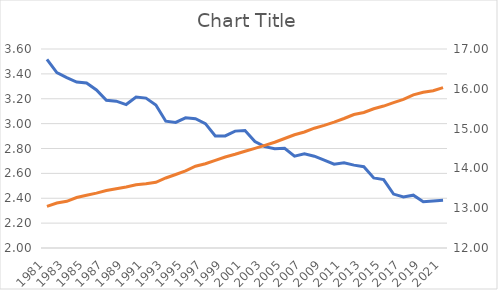
| Category | Relative price |
|---|---|
| 1981.0 | 3.517 |
| 1982.0 | 3.41 |
| 1983.0 | 3.369 |
| 1984.0 | 3.335 |
| 1985.0 | 3.326 |
| 1986.0 | 3.27 |
| 1987.0 | 3.187 |
| 1988.0 | 3.18 |
| 1989.0 | 3.153 |
| 1990.0 | 3.213 |
| 1991.0 | 3.205 |
| 1992.0 | 3.15 |
| 1993.0 | 3.02 |
| 1994.0 | 3.01 |
| 1995.0 | 3.047 |
| 1996.0 | 3.039 |
| 1997.0 | 3 |
| 1998.0 | 2.901 |
| 1999.0 | 2.901 |
| 2000.0 | 2.94 |
| 2001.0 | 2.945 |
| 2002.0 | 2.856 |
| 2003.0 | 2.815 |
| 2004.0 | 2.798 |
| 2005.0 | 2.802 |
| 2006.0 | 2.739 |
| 2007.0 | 2.757 |
| 2008.0 | 2.738 |
| 2009.0 | 2.706 |
| 2010.0 | 2.674 |
| 2011.0 | 2.685 |
| 2012.0 | 2.666 |
| 2013.0 | 2.654 |
| 2014.0 | 2.563 |
| 2015.0 | 2.55 |
| 2016.0 | 2.434 |
| 2017.0 | 2.411 |
| 2018.0 | 2.425 |
| 2019.0 | 2.372 |
| 2020.0 | 2.378 |
| 2021.0 | 2.383 |